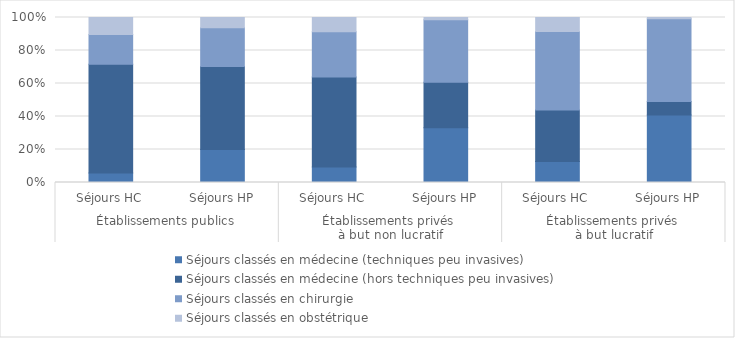
| Category | Séjours classés en médecine (techniques peu invasives) | Séjours classés en médecine (hors techniques peu invasives) | Séjours classés en chirurgie | Séjours classés en obstétrique |
|---|---|---|---|---|
| 0 | 370709 | 4226639 | 1160871 | 659069 |
| 1 | 716310 | 1809146 | 838694 | 225388 |
| 2 | 72449 | 424270 | 213905 | 66663 |
| 3 | 288514 | 240510 | 329453 | 11913 |
| 4 | 258704 | 631387 | 966577 | 170464 |
| 5 | 1756173 | 347704 | 2152100 | 31667 |